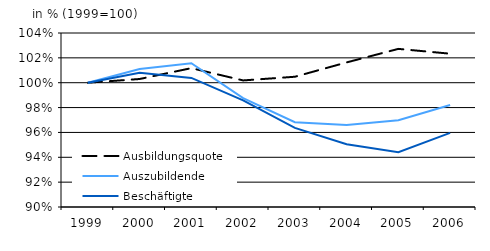
| Category | Ausbildungsquote | Auszubildende | Beschäftigte |
|---|---|---|---|
| 1999.0 | 1 | 1 | 1 |
| 2000.0 | 1.003 | 1.011 | 1.008 |
| 2001.0 | 1.012 | 1.016 | 1.004 |
| 2002.0 | 1.002 | 0.988 | 0.986 |
| 2003.0 | 1.005 | 0.968 | 0.964 |
| 2004.0 | 1.016 | 0.966 | 0.95 |
| 2005.0 | 1.027 | 0.97 | 0.944 |
| 2006.0 | 1.023 | 0.982 | 0.96 |